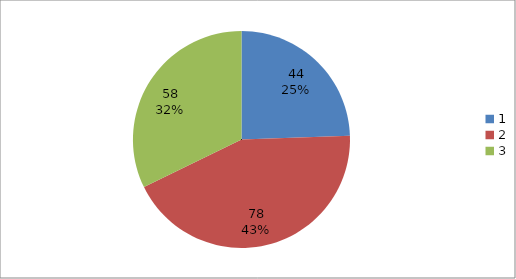
| Category | Series 0 |
|---|---|
| 0 | 44 |
| 1 | 78 |
| 2 | 58 |